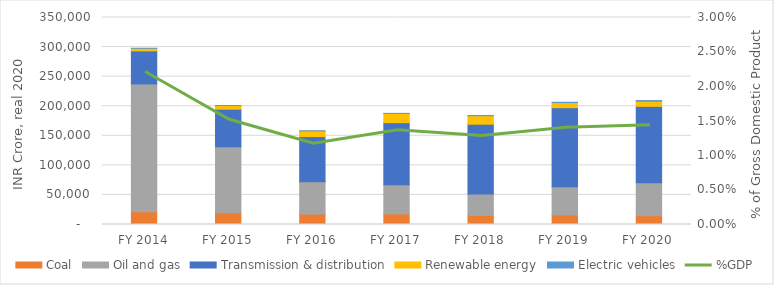
| Category | Coal | Oil and gas | Transmission & distribution | Renewable energy | Electric vehicles |
|---|---|---|---|---|---|
| FY 2014 | 21524.435 | 216134.56 | 55910.851 | 4292.105 | 14.381 |
| FY 2015 | 19932.211 | 111436.412 | 63602.044 | 6173.49 | 20.429 |
| FY 2016 | 17647.41 | 54784.701 | 76148.51 | 9649.474 | 133.227 |
| FY 2017 | 17905.104 | 49203.038 | 105060.152 | 15470.088 | 285.117 |
| FY 2018 | 15189.929 | 36463.763 | 117890.662 | 14396.363 | 425.718 |
| FY 2019 | 16141.39 | 47683.954 | 133686.775 | 8672.725 | 484.823 |
| FY 2020 | 14907.668 | 55669.919 | 129256.34 | 8577.283 | 1140.752 |